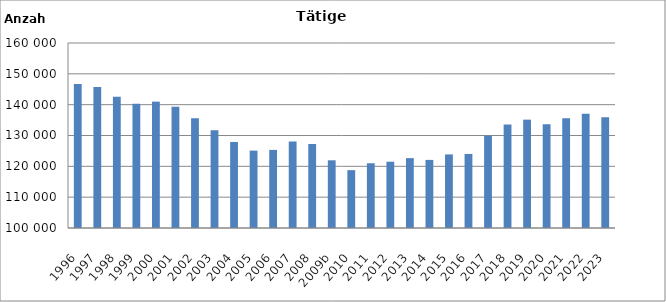
| Category | Series 0 |
|---|---|
| 1996 | 146742 |
| 1997 | 145717 |
| 1998 | 142598 |
| 1999 | 140319 |
| 2000 | 140983 |
| 2001 | 139341 |
| 2002 | 135596 |
| 2003 | 131743 |
| 2004 | 127904 |
| 2005 | 125099 |
| 2006 | 125327 |
| 2007 | 128030 |
| 2008 | 127238 |
| 2009b | 121954 |
| 2010 | 118762 |
| 2011 | 121003 |
| 2012 | 121500 |
| 2013 | 122658 |
| 2014 | 122086 |
| 2015 | 123861 |
| 2016 | 124018 |
| 2017 | 129935 |
| 2018 | 133536 |
| 2019 | 135140 |
| 2020 | 133658 |
| 2021 | 135579 |
| 2022 | 137016 |
| 2023 | 135942 |